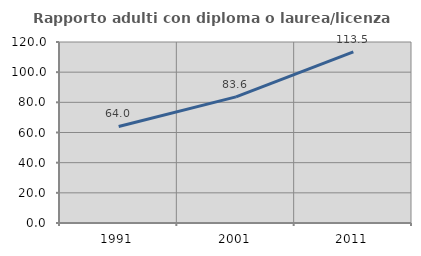
| Category | Rapporto adulti con diploma o laurea/licenza media  |
|---|---|
| 1991.0 | 64.017 |
| 2001.0 | 83.613 |
| 2011.0 | 113.489 |